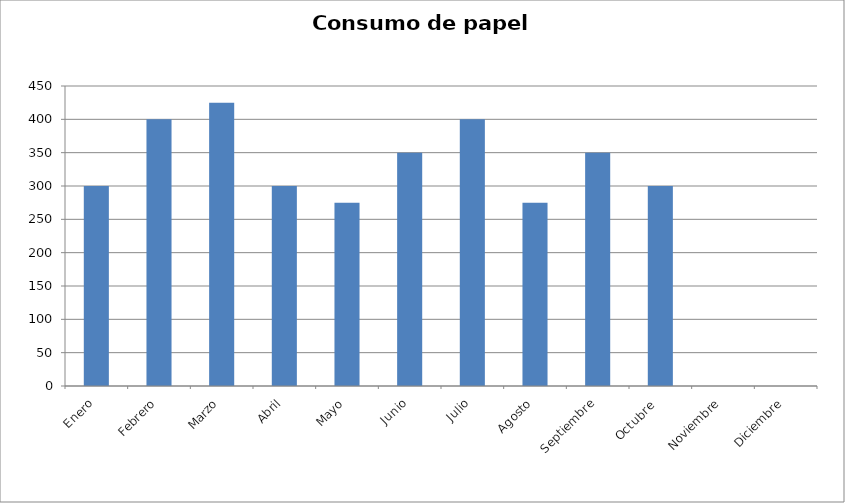
| Category | Series 0 |
|---|---|
| Enero | 300 |
| Febrero | 400 |
| Marzo | 425 |
| Abril | 300 |
| Mayo | 275 |
| Junio | 350 |
| Julio | 400 |
| Agosto | 275 |
| Septiembre | 350 |
| Octubre  | 300 |
| Noviembre | 0 |
| Diciembre | 0 |